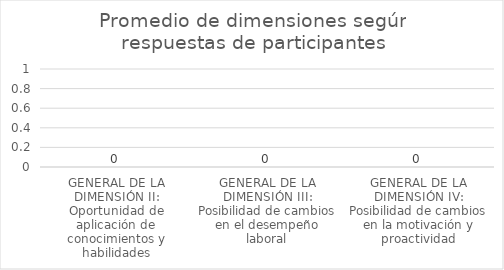
| Category | Series 0 |
|---|---|
| GENERAL DE LA DIMENSIÓN II: Oportunidad de aplicación de conocimientos y habilidades | 0 |
| GENERAL DE LA DIMENSIÓN III: Posibilidad de cambios en el desempeño laboral | 0 |
| GENERAL DE LA DIMENSIÓN IV: Posibilidad de cambios en la motivación y proactividad | 0 |